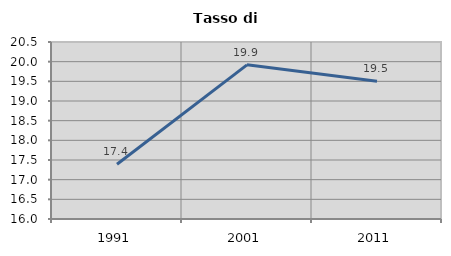
| Category | Tasso di disoccupazione   |
|---|---|
| 1991.0 | 17.391 |
| 2001.0 | 19.92 |
| 2011.0 | 19.503 |